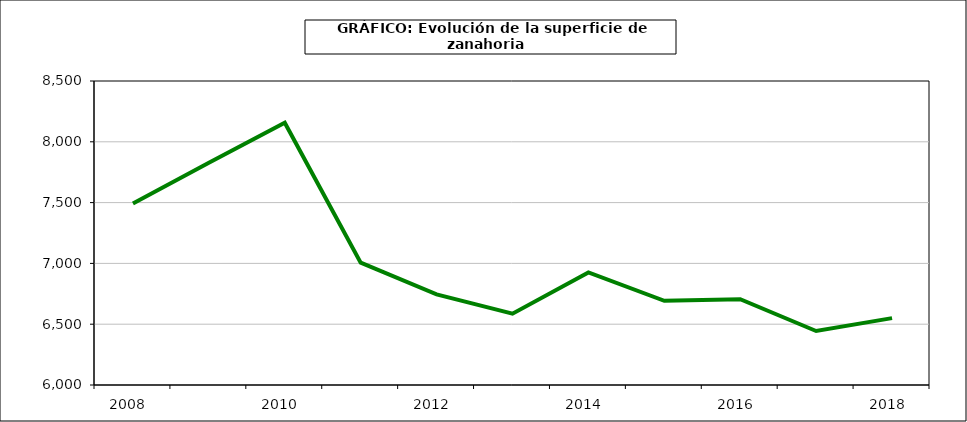
| Category | superficie |
|---|---|
| 2008.0 | 7492 |
| 2009.0 | 7828 |
| 2010.0 | 8157 |
| 2011.0 | 7006 |
| 2012.0 | 6745 |
| 2013.0 | 6586 |
| 2014.0 | 6926 |
| 2015.0 | 6692 |
| 2016.0 | 6705 |
| 2017.0 | 6444 |
| 2018.0 | 6550 |